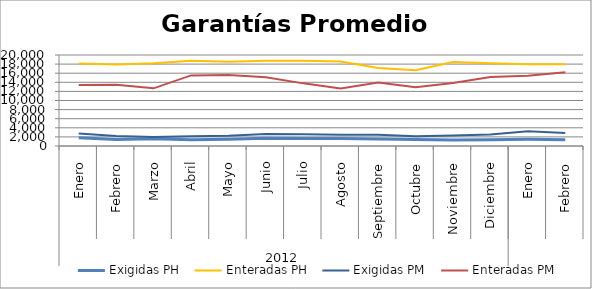
| Category | Exigidas PH | Enteradas PH | Exigidas PM | Enteradas PM |
|---|---|---|---|---|
| 0 | 1828.564 | 18155.583 | 2744.93 | 13413.991 |
| 1 | 1451.155 | 17917.734 | 2215.902 | 13440.832 |
| 2 | 1587.31 | 18166.129 | 1968.766 | 12673.714 |
| 3 | 1353.003 | 18741.256 | 2118.782 | 15515.723 |
| 4 | 1464.668 | 18540.927 | 2278.002 | 15625.393 |
| 5 | 1719.43 | 18734.539 | 2626.915 | 15127.903 |
| 6 | 1674.023 | 18761.463 | 2556.575 | 13766.49 |
| 7 | 1647.243 | 18544.546 | 2463.76 | 12637.427 |
| 8 | 1556.152 | 17124.972 | 2459.803 | 13929.715 |
| 9 | 1402.926 | 16653.067 | 2169.047 | 12937.81 |
| 10 | 1329.011 | 18467.462 | 2322.009 | 13825.53 |
| 11 | 1379.519 | 18204.98 | 2522.413 | 15188.776 |
| 12 | 1462.675 | 17957.148 | 3246.817 | 15415.235 |
| 13 | 1398.609 | 17993.637 | 2845.352 | 16230.589 |